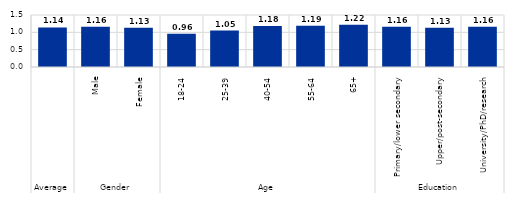
| Category | Series 0 |
|---|---|
| 0 | 1.14 |
| 1 | 1.16 |
| 2 | 1.13 |
| 3 | 0.96 |
| 4 | 1.05 |
| 5 | 1.18 |
| 6 | 1.19 |
| 7 | 1.22 |
| 8 | 1.16 |
| 9 | 1.13 |
| 10 | 1.16 |